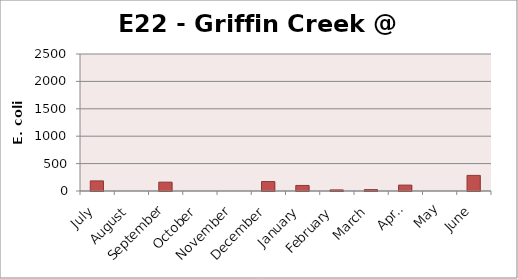
| Category | E. coli MPN |
|---|---|
| July | 184.2 |
| August | 0 |
| September | 161.6 |
| October | 0 |
| November | 0 |
| December | 172.3 |
| January | 101.4 |
| February | 19.9 |
| March | 25.3 |
| April | 107.6 |
| May | 0 |
| June | 285.1 |